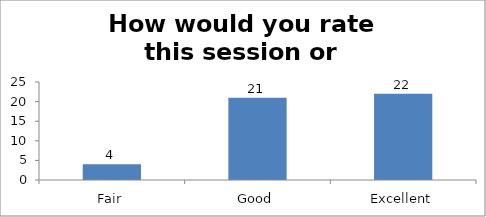
| Category | How would you rate this session or workshop? |
|---|---|
| Fair | 4 |
| Good | 21 |
| Excellent | 22 |